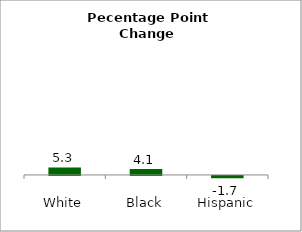
| Category | Series 0 |
|---|---|
| White | 5.341 |
| Black | 4.136 |
| Hispanic | -1.703 |